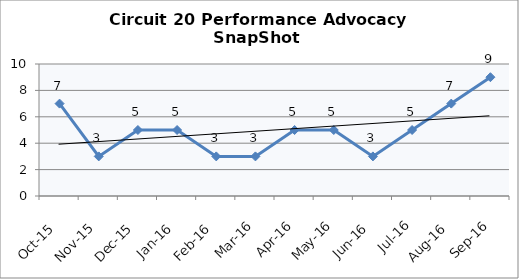
| Category | Circuit 20 |
|---|---|
| Oct-15 | 7 |
| Nov-15 | 3 |
| Dec-15 | 5 |
| Jan-16 | 5 |
| Feb-16 | 3 |
| Mar-16 | 3 |
| Apr-16 | 5 |
| May-16 | 5 |
| Jun-16 | 3 |
| Jul-16 | 5 |
| Aug-16 | 7 |
| Sep-16 | 9 |